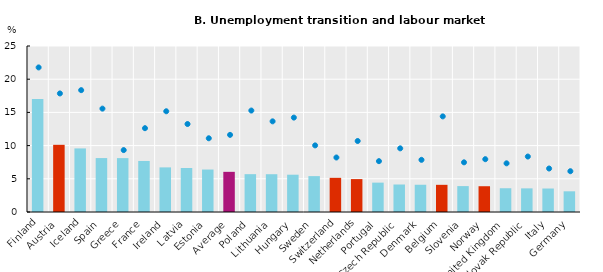
| Category | People without disability |
|---|---|
| Finland | 17.025 |
| Austria | 10.118 |
| Iceland | 9.576 |
| Spain | 8.121 |
| Greece | 8.115 |
| France | 7.687 |
| Ireland | 6.719 |
| Latvia | 6.623 |
| Estonia | 6.395 |
| Average | 6.049 |
| Poland | 5.698 |
| Lithuania | 5.69 |
| Hungary | 5.617 |
| Sweden | 5.403 |
| Switzerland | 5.144 |
| Netherlands | 4.955 |
| Portugal | 4.423 |
| Czech Republic | 4.141 |
| Denmark | 4.104 |
| Belgium | 4.092 |
| Slovenia | 3.901 |
| Norway | 3.882 |
| United Kingdom | 3.578 |
| Slovak Republic | 3.559 |
| Italy | 3.538 |
| Germany | 3.116 |